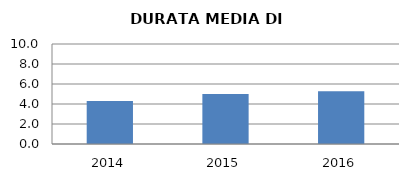
| Category | 2014 2015 2016 |
|---|---|
| 2014.0 | 4.308 |
| 2015.0 | 5 |
| 2016.0 | 5.286 |